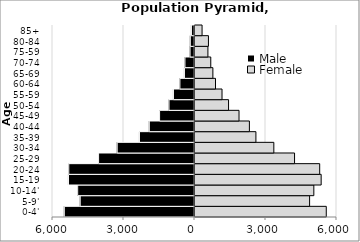
| Category | Male | Female |
|---|---|---|
| 0-4' | -5501.59 | 5546.64 |
| 5-9' | -4829.8 | 4842.6 |
| 10-14' | -4936.12 | 5021.27 |
| 15-19 | -5325.67 | 5331.03 |
| 20-24 | -5312.07 | 5269.04 |
| 25-29 | -4052.79 | 4206.33 |
| 30-34 | -3266.79 | 3330.91 |
| 35-39 | -2325.95 | 2573.8 |
| 40-44 | -1909.8 | 2298.63 |
| 45-49 | -1475.08 | 1859.84 |
| 50-54 | -1077.58 | 1417.52 |
| 55-59 | -889.57 | 1141.98 |
| 60-64 | -617.17 | 866.2 |
| 65-69 | -425.25 | 755.86 |
| 70-74 | -403.57 | 666.53 |
| 75-59 | -188.05 | 545.75 |
| 80-84 | -177.3 | 567.83 |
| 85+ | -129.64 | 298.82 |